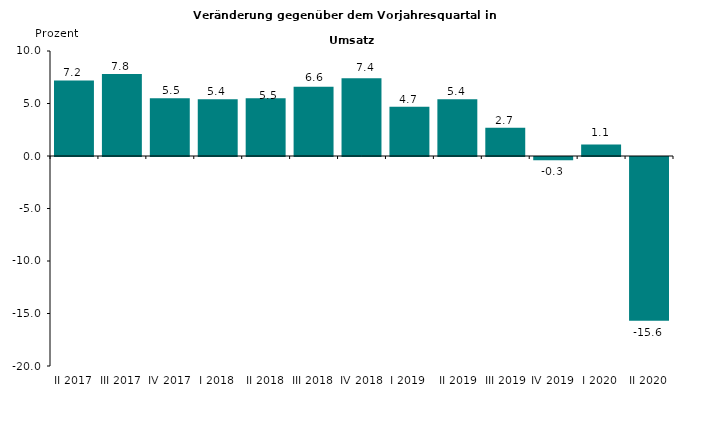
| Category | Series 0 |
|---|---|
| II 2017 | 7.2 |
| III 2017 | 7.8 |
| IV 2017 | 5.5 |
| I 2018 | 5.4 |
| II 2018 | 5.5 |
| III 2018 | 6.6 |
| IV 2018 | 7.4 |
| I 2019 | 4.7 |
|  II 2019 | 5.4 |
|  III 2019 | 2.7 |
| IV 2019 | -0.3 |
| I 2020 | 1.1 |
| II 2020 | -15.6 |